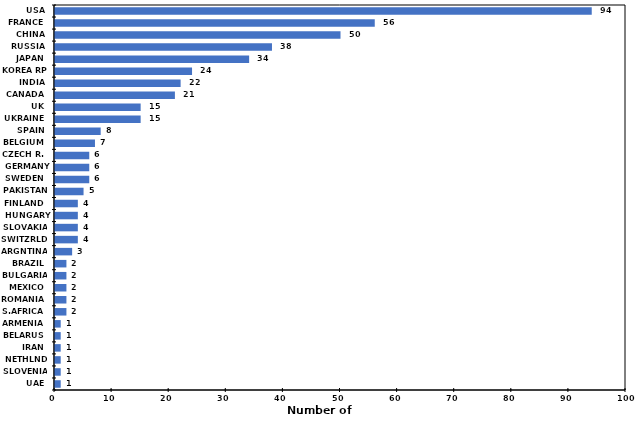
| Category | Series 0 |
|---|---|
| USA | 94 |
| FRANCE | 56 |
| CHINA | 50 |
| RUSSIA | 38 |
| JAPAN | 34 |
| KOREA RP | 24 |
| INDIA | 22 |
| CANADA | 21 |
| UK | 15 |
| UKRAINE | 15 |
| SPAIN | 8 |
| BELGIUM | 7 |
| CZECH R. | 6 |
| GERMANY | 6 |
| SWEDEN | 6 |
| PAKISTAN | 5 |
| FINLAND | 4 |
| HUNGARY | 4 |
| SLOVAKIA | 4 |
| SWITZRLD | 4 |
| ARGNTINA | 3 |
| BRAZIL | 2 |
| BULGARIA | 2 |
| MEXICO | 2 |
| ROMANIA | 2 |
| S.AFRICA | 2 |
| ARMENIA | 1 |
| BELARUS | 1 |
| IRAN | 1 |
| NETHLNDS | 1 |
| SLOVENIA | 1 |
| UAE | 1 |